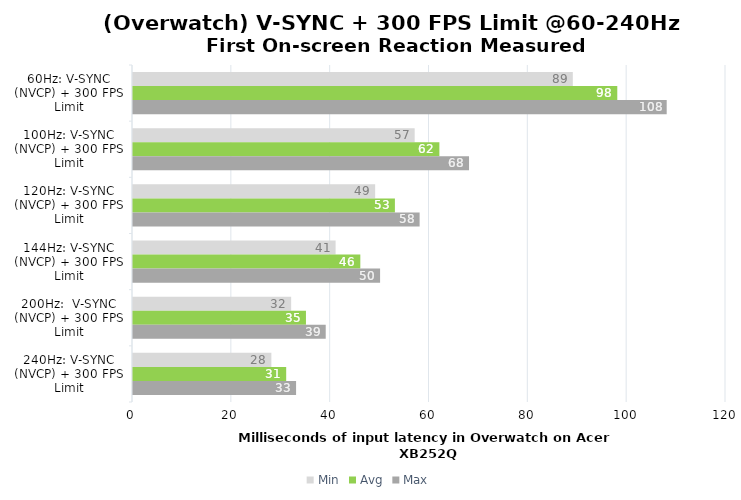
| Category | Min | Avg | Max |
|---|---|---|---|
| 60Hz: V-SYNC (NVCP) + 300 FPS Limit | 89 | 98 | 108 |
| 100Hz: V-SYNC (NVCP) + 300 FPS Limit | 57 | 62 | 68 |
| 120Hz: V-SYNC (NVCP) + 300 FPS Limit | 49 | 53 | 58 |
| 144Hz: V-SYNC (NVCP) + 300 FPS Limit | 41 | 46 | 50 |
| 200Hz:  V-SYNC (NVCP) + 300 FPS Limit | 32 | 35 | 39 |
| 240Hz: V-SYNC (NVCP) + 300 FPS Limit | 28 | 31 | 33 |